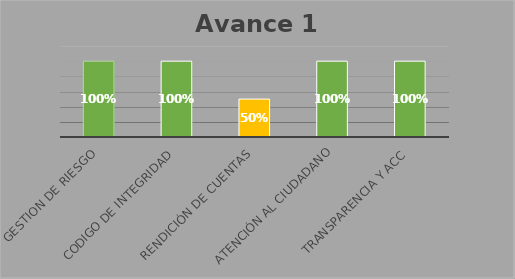
| Category | Series 0 |
|---|---|
| GESTION DE RIESGO | 1 |
| CODIGO DE INTEGRIDAD | 1 |
| RENDICIÓN DE CUENTAS | 0.5 |
| ATENCIÓN AL CIUDADANO | 1 |
| TRANSPARENCIA Y ACC | 1 |